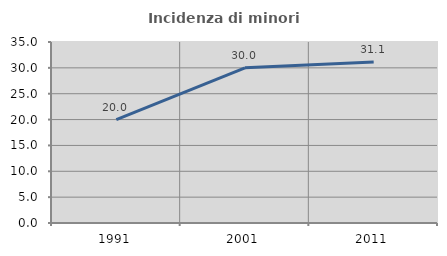
| Category | Incidenza di minori stranieri |
|---|---|
| 1991.0 | 20 |
| 2001.0 | 30 |
| 2011.0 | 31.125 |